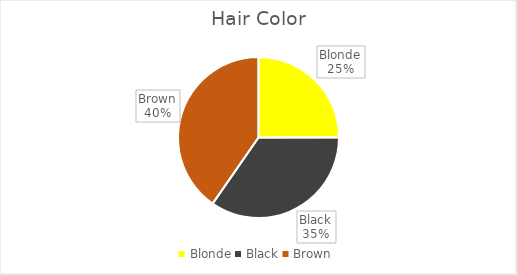
| Category | Series 0 |
|---|---|
| Blonde | 0.25 |
| Black | 0.347 |
| Brown | 0.403 |